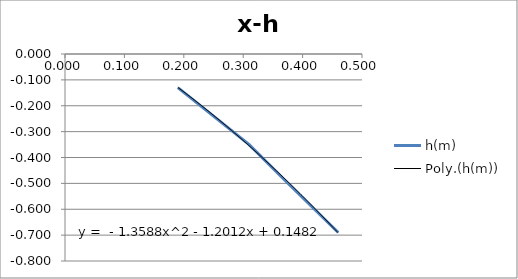
| Category | h(m) |
|---|---|
| 0.46 | -0.69 |
| 0.38 | -0.51 |
| 0.31 | -0.35 |
| 0.19 | -0.13 |